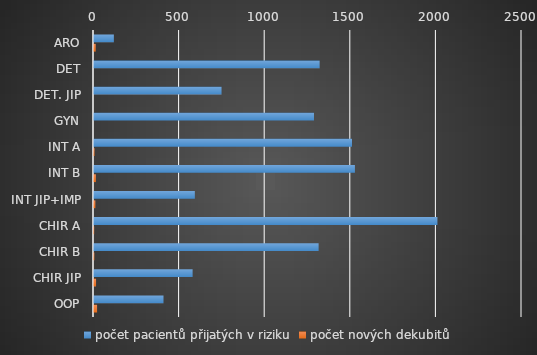
| Category | počet pacientů přijatých v riziku | počet nových dekubitů |
|---|---|---|
| ARO | 116 | 10 |
| DET | 1318 | 0 |
| DET. JIP | 745 | 0 |
| GYN | 1285 | 0 |
| INT A | 1507 | 3 |
| INT B | 1524 | 11 |
| INT JIP+IMP | 589 | 8 |
| CHIR A | 2006 | 1 |
| CHIR B | 1312 | 2 |
| CHIR JIP | 576 | 12 |
| OOP | 406 | 18 |